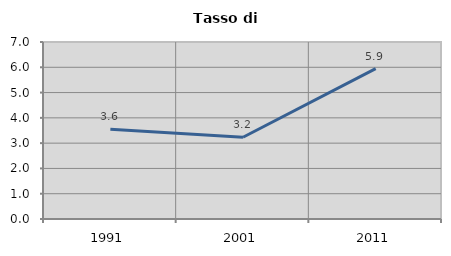
| Category | Tasso di disoccupazione   |
|---|---|
| 1991.0 | 3.551 |
| 2001.0 | 3.234 |
| 2011.0 | 5.945 |